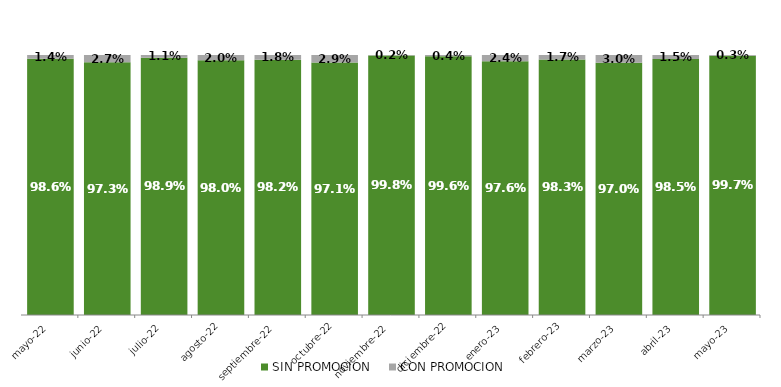
| Category | SIN PROMOCION   | CON PROMOCION   |
|---|---|---|
| 2022-05-01 | 0.986 | 0.014 |
| 2022-06-01 | 0.973 | 0.027 |
| 2022-07-01 | 0.989 | 0.011 |
| 2022-08-01 | 0.98 | 0.02 |
| 2022-09-01 | 0.982 | 0.018 |
| 2022-10-01 | 0.971 | 0.029 |
| 2022-11-01 | 0.998 | 0.002 |
| 2022-12-01 | 0.996 | 0.004 |
| 2023-01-01 | 0.976 | 0.024 |
| 2023-02-01 | 0.983 | 0.017 |
| 2023-03-01 | 0.97 | 0.03 |
| 2023-04-01 | 0.985 | 0.015 |
| 2023-05-01 | 0.997 | 0.003 |